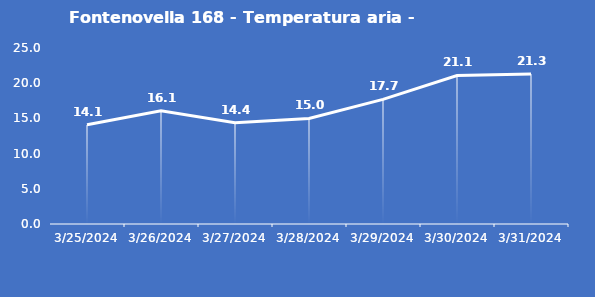
| Category | Fontenovella 168 - Temperatura aria - Grezzo (°C) |
|---|---|
| 3/25/24 | 14.1 |
| 3/26/24 | 16.1 |
| 3/27/24 | 14.4 |
| 3/28/24 | 15 |
| 3/29/24 | 17.7 |
| 3/30/24 | 21.1 |
| 3/31/24 | 21.3 |